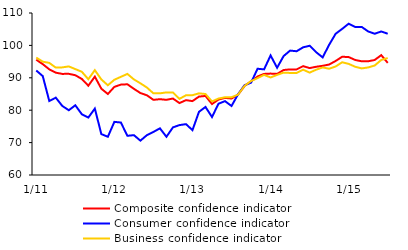
| Category | Composite confidence indicator | Consumer confidence indicator | Business confidence indicator |
|---|---|---|---|
|  1/11 | 95.573 | 92.257 | 96.247 |
| 2 | 94.219 | 90.518 | 94.973 |
| 3 | 92.615 | 82.847 | 94.603 |
| 4 | 91.578 | 83.87 | 93.146 |
| 5 | 91.206 | 81.313 | 93.219 |
| 6 | 91.223 | 79.983 | 93.51 |
| 7 | 90.799 | 81.517 | 92.688 |
| 8 | 89.645 | 78.756 | 91.861 |
| 9 | 87.565 | 77.733 | 89.566 |
| 10 | 90.354 | 80.494 | 92.36 |
| 11 | 86.636 | 72.619 | 89.488 |
| 12 | 85 | 71.8 | 87.7 |
|  1/12 | 87.2 | 76.4 | 89.4 |
| 2 | 87.9 | 76.2 | 90.3 |
| 3 | 88 | 72.1 | 91.2 |
| 4 | 86.6 | 72.3 | 89.5 |
| 5 | 85.3 | 70.6 | 88.3 |
| 6 | 84.6 | 72.3 | 87 |
| 7 | 83.2 | 73.3 | 85.2 |
| 8 | 83.4 | 74.4 | 85.2 |
| 9 | 83.2 | 71.8 | 85.5 |
| 10 | 83.6 | 74.7 | 85.5 |
| 11 | 82.2 | 75.4 | 83.5 |
| 12 | 83.1 | 75.7 | 84.6 |
|  1/13 | 82.809 | 73.846 | 84.633 |
| 2 | 84.2 | 79.5 | 85.2 |
| 3 | 84.4 | 81 | 85 |
| 4 | 81.9 | 77.9 | 82.7 |
| 5 | 83.3 | 82 | 83.6 |
| 6 | 83.8 | 82.8 | 84 |
| 7 | 83.6 | 81.3 | 84 |
| 8 | 84.8 | 84.9 | 84.8 |
| 9 | 87.5 | 87.7 | 87.5 |
| 10 | 88.9 | 88.5 | 89 |
| 11 | 90.4 | 92.8 | 89.9 |
| 12 | 91.2 | 92.6 | 90.9 |
|  1/14 | 91.3 | 96.9 | 90.1 |
|  2 | 91.2 | 93.1 | 90.9 |
| 3 | 92.4 | 96.7 | 91.6 |
| 4 | 92.6 | 98.4 | 91.5 |
| 5 | 92.6 | 98.2 | 91.5 |
| 6 | 93.6 | 99.4 | 92.5 |
| 7 | 93 | 99.9 | 91.6 |
| 8 | 93.4 | 97.9 | 92.5 |
| 9 | 93.7 | 96.3 | 93.2 |
| 10 | 94.1 | 100.2 | 92.8 |
| 11 | 95.2 | 103.6 | 93.5 |
| 12 | 96.5 | 105.1 | 94.8 |
|  1/15 | 96.4 | 106.7 | 94.3 |
| 2 | 95.5 | 105.7 | 93.4 |
| 3 | 95.1 | 105.7 | 92.9 |
| 4 | 95.1 | 104.3 | 93.2 |
| 5 | 95.5 | 103.6 | 93.8 |
| 6 | 97 | 104.3 | 95.5 |
| 7 | 94.6 | 103.6 | 96.1 |